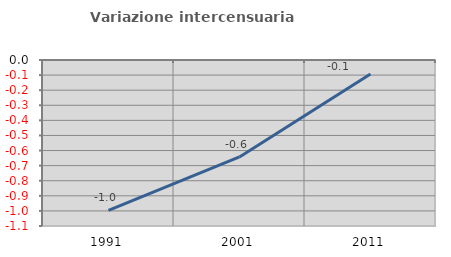
| Category | Variazione intercensuaria annua |
|---|---|
| 1991.0 | -0.996 |
| 2001.0 | -0.642 |
| 2011.0 | -0.093 |